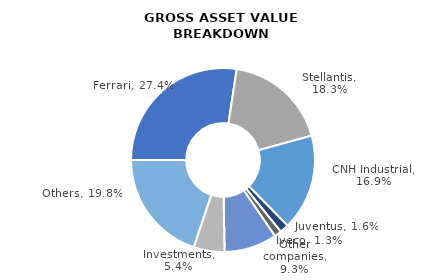
| Category | 31 Dec 2022 |
|---|---|
| Ferrari | 8896 |
| Stellantis | 5961 |
| CNH Industrial | 5491 |
| Juventus | 510 |
| Iveco | 408 |
| Philips | 0 |
| Other companies | 3012 |
| Investments | 1766 |
| Others | 6443 |